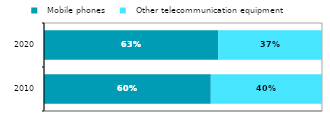
| Category |   Mobile phones |   Other telecommunication equipment |
|---|---|---|
| 2010.0 | 0.6 | 0.4 |
| 2020.0 | 0.626 | 0.374 |